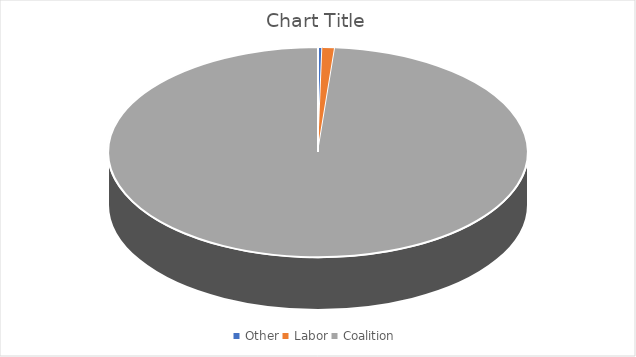
| Category | Series 0 |
|---|---|
| Other | 13750 |
| Labor | 40550 |
| Coalition | 4124180.2 |